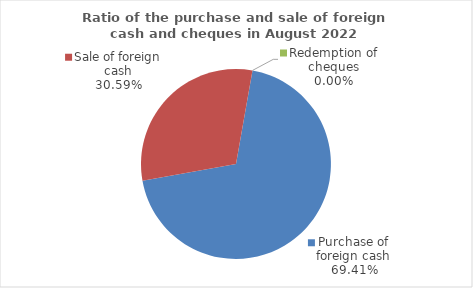
| Category | Series 0 |
|---|---|
| Purchase of foreign cash | 69.415 |
| Sale of foreign cash | 30.585 |
| Redemption of cheques | 0 |